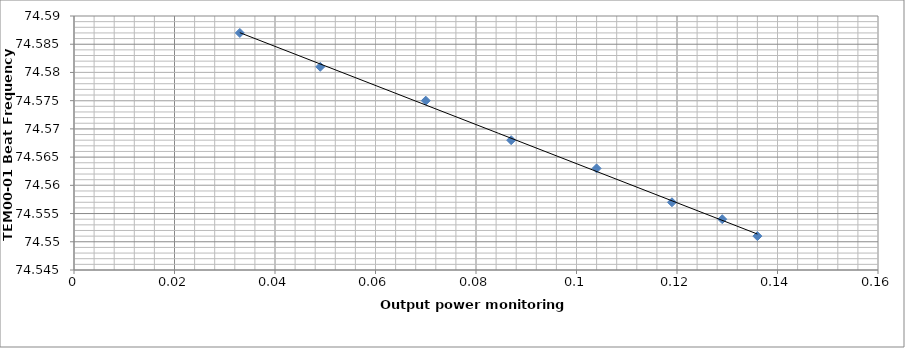
| Category | Series 0 |
|---|---|
| 0.136 | 74.551 |
| 0.129 | 74.554 |
| 0.119 | 74.557 |
| 0.104 | 74.563 |
| 0.087 | 74.568 |
| 0.07 | 74.575 |
| 0.049 | 74.581 |
| 0.033 | 74.587 |